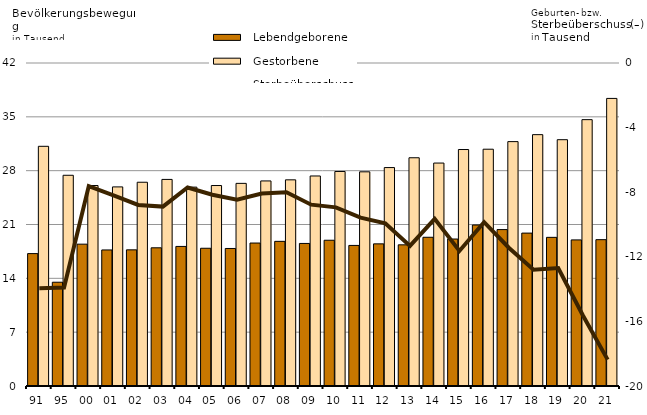
| Category |   Lebendgeborene |   Gestorbene |
|---|---|---|
| 91 | 17.215 | 31.167 |
| 95 | 13.494 | 27.401 |
| 00 | 18.444 | 26.068 |
| 01 | 17.692 | 25.889 |
| 02 | 17.704 | 26.494 |
| 03 | 17.97 | 26.862 |
| 04 | 18.148 | 25.859 |
| 05 | 17.91 | 26.069 |
| 06 | 17.883 | 26.348 |
| 07 | 18.589 | 26.666 |
| 08 | 18.808 | 26.807 |
| 09 | 18.537 | 27.309 |
| 10 | 18.954 | 27.894 |
| 11 | 18.279 | 27.851 |
| 12 | 18.482 | 28.403 |
| 13 | 18.355 | 29.678 |
| 14 | 19.339 | 28.99 |
| 15 | 19.112 | 30.75 |
| 16 | 20.934 | 30.79 |
| 17 | 20.338 | 31.778 |
| 18 | 19.881 | 32.684 |
| 19 | 19.329 | 32.027 |
| 20 | 18.998 | 34.633 |
| 21 | 19.029 | 37.396 |